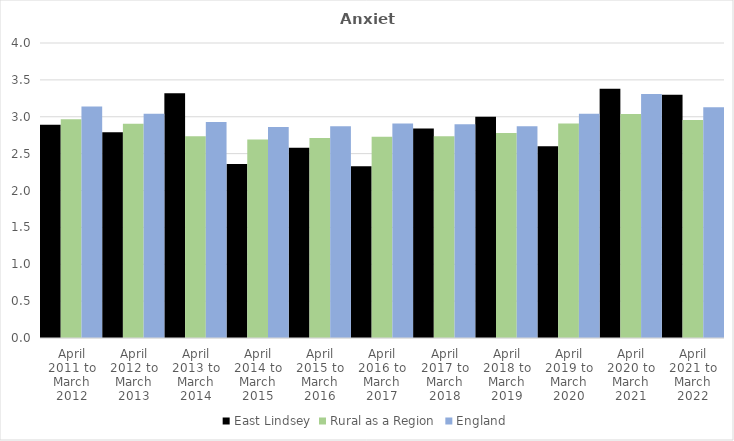
| Category | East Lindsey | Rural as a Region | England |
|---|---|---|---|
| April 2011 to March 2012 | 2.89 | 2.967 | 3.14 |
| April 2012 to March 2013 | 2.79 | 2.904 | 3.04 |
| April 2013 to March 2014 | 3.32 | 2.734 | 2.93 |
| April 2014 to March 2015 | 2.36 | 2.691 | 2.86 |
| April 2015 to March 2016 | 2.58 | 2.711 | 2.87 |
| April 2016 to March 2017 | 2.33 | 2.729 | 2.91 |
| April 2017 to March 2018 | 2.84 | 2.736 | 2.9 |
| April 2018 to March 2019 | 3 | 2.78 | 2.87 |
| April 2019 to March 2020 | 2.6 | 2.908 | 3.04 |
| April 2020 to March 2021 | 3.38 | 3.036 | 3.31 |
| April 2021 to March 2022 | 3.3 | 2.956 | 3.13 |